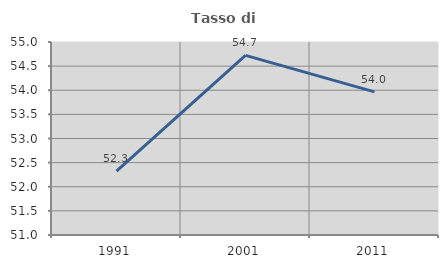
| Category | Tasso di occupazione   |
|---|---|
| 1991.0 | 52.325 |
| 2001.0 | 54.722 |
| 2011.0 | 53.967 |